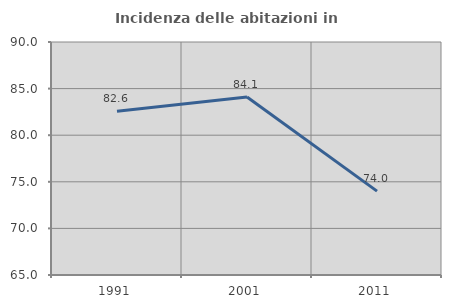
| Category | Incidenza delle abitazioni in proprietà  |
|---|---|
| 1991.0 | 82.576 |
| 2001.0 | 84.091 |
| 2011.0 | 74 |